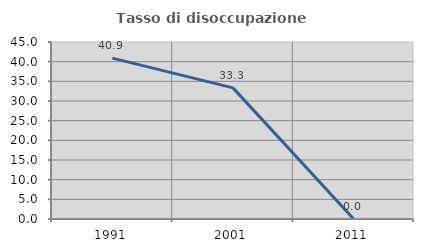
| Category | Tasso di disoccupazione giovanile  |
|---|---|
| 1991.0 | 40.909 |
| 2001.0 | 33.333 |
| 2011.0 | 0 |